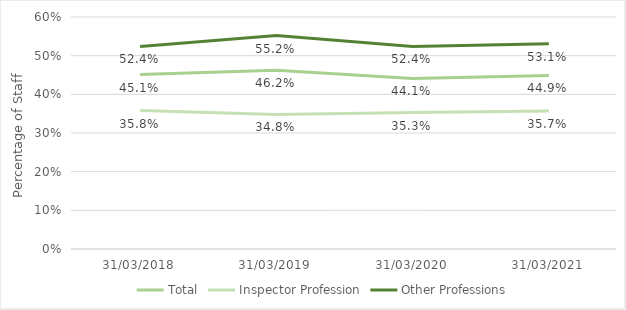
| Category | Total | Inspector Profession | Other Professions |
|---|---|---|---|
| 31/03/2018 | 0.451 | 0.358 | 0.524 |
| 31/03/2019 | 0.462 | 0.348 | 0.552 |
| 31/03/2020 | 0.441 | 0.353 | 0.524 |
| 31/03/2021 | 0.449 | 0.357 | 0.531 |